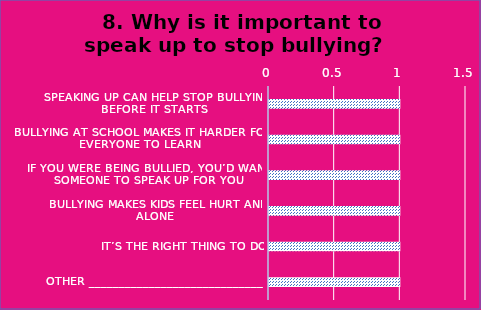
| Category | Field1 |
|---|---|
| Speaking up can help stop bullying before it starts | 1 |
| Bullying at school makes it harder for everyone to learn | 1 |
| If you were being bullied, you’d want someone to speak up for you | 1 |
| Bullying makes kids feel hurt and alone | 1 |
| It’s the right thing to do | 1 |
| Other ________________________________ | 1 |